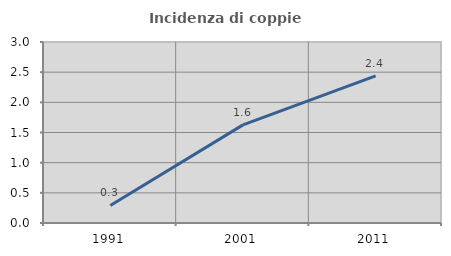
| Category | Incidenza di coppie miste |
|---|---|
| 1991.0 | 0.291 |
| 2001.0 | 1.626 |
| 2011.0 | 2.439 |